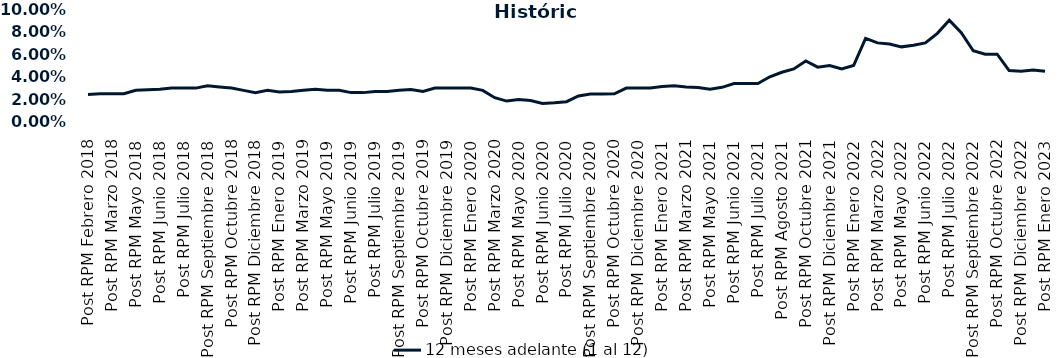
| Category | 12 meses adelante (1 al 12)  |
|---|---|
| Post RPM Febrero 2018 | 0.024 |
| Pre RPM Marzo 2018 | 0.025 |
| Post RPM Marzo 2018 | 0.025 |
| Pre RPM Mayo 2018 | 0.025 |
| Post RPM Mayo 2018 | 0.028 |
| Pre RPM Junio 2018 | 0.028 |
| Post RPM Junio 2018 | 0.029 |
| Pre RPM Julio 2018 | 0.03 |
| Post RPM Julio 2018 | 0.03 |
| Pre RPM Septiembre 2018 | 0.03 |
| Post RPM Septiembre 2018 | 0.032 |
| Pre RPM Octubre 2018 | 0.031 |
| Post RPM Octubre 2018 | 0.03 |
| Pre RPM Diciembre 2018 | 0.028 |
| Post RPM Diciembre 2018 | 0.026 |
| Pre RPM Enero 2019 | 0.028 |
| Post RPM Enero 2019 | 0.026 |
| Pre RPM Marzo 2019 | 0.027 |
| Post RPM Marzo 2019 | 0.028 |
| Pre RPM Mayo 2019 | 0.029 |
| Post RPM Mayo 2019 | 0.028 |
| Pre RPM Junio 2019 | 0.028 |
| Post RPM Junio 2019 | 0.026 |
| Pre RPM Julio 2019 | 0.026 |
| Post RPM Julio 2019 | 0.027 |
| Pre RPM Septiembre 2019 | 0.027 |
| Post RPM Septiembre 2019 | 0.028 |
| Pre RPM Octubre 2019 | 0.029 |
| Post RPM Octubre 2019 | 0.027 |
| Pre RPM Diciembre 2019 | 0.03 |
| Post RPM Diciembre 2019 | 0.03 |
| Pre RPM Enero 2020 | 0.03 |
| Post RPM Enero 2020 | 0.03 |
| Pre RPM Marzo 2020 | 0.028 |
| Post RPM Marzo 2020 | 0.022 |
| Pre RPM Mayo 2020 | 0.018 |
| Post RPM Mayo 2020 | 0.02 |
| Pre RPM Junio 2020 | 0.019 |
| Post RPM Junio 2020 | 0.016 |
| Pre RPM Julio 2020 | 0.017 |
| Post RPM Julio 2020 | 0.018 |
| Pre RPM Septiembre 2020 | 0.023 |
| Post RPM Septiembre 2020 | 0.025 |
| Pre RPM Octubre 2020 | 0.025 |
| Post RPM Octubre 2020 | 0.025 |
| Pre RPM Diciembre 2020 | 0.03 |
| Post RPM Diciembre 2020 | 0.03 |
| Pre RPM Enero 2021 | 0.03 |
| Post RPM Enero 2021 | 0.032 |
| Pre RPM Marzo 2021 | 0.032 |
| Post RPM Marzo 2021 | 0.031 |
| Pre RPM Mayo 2021 | 0.03 |
| Post RPM Mayo 2021 | 0.029 |
| Pre RPM Junio 2021 | 0.031 |
| Post RPM Junio 2021 | 0.034 |
| Pre RPM Julio 2021 | 0.034 |
| Post RPM Julio 2021 | 0.034 |
| Pre RPM Agosto 2021 | 0.04 |
| Post RPM Agosto 2021 | 0.044 |
| Pre RPM Octubre 2021 | 0.047 |
| Post RPM Octubre 2021 | 0.054 |
| Pre RPM Diciembre 2021 | 0.048 |
| Post RPM Diciembre 2021 | 0.05 |
| Pre RPM Enero 2022 | 0.047 |
| Post RPM Enero 2022 | 0.05 |
| Pre RPM Marzo 2022 | 0.074 |
| Post RPM Marzo 2022 | 0.07 |
| Pre RPM Mayo 2022 | 0.069 |
| Post RPM Mayo 2022 | 0.066 |
| Pre RPM Junio 2022 | 0.068 |
| Post RPM Junio 2022 | 0.07 |
| Pre RPM Julio 2022 | 0.078 |
| Post RPM Julio 2022 | 0.09 |
| Pre RPM Septiembre 2022 | 0.079 |
| Post RPM Septiembre 2022 | 0.063 |
| Pre RPM Octubre 2022 | 0.06 |
| Post RPM Octubre 2022 | 0.06 |
| Pre RPM Diciembre 2022 | 0.046 |
| Post RPM Diciembre 2022 | 0.045 |
| Pre RPM Enero 2023 | 0.046 |
| Post RPM Enero 2023 | 0.045 |